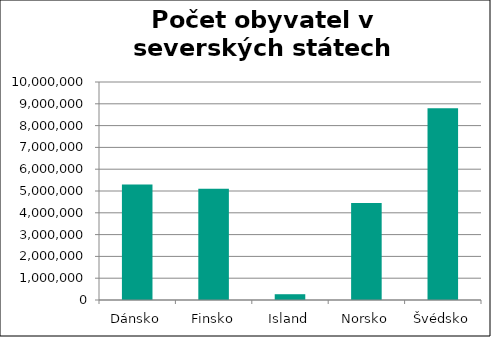
| Category | obyvatelstvo |
|---|---|
| Dánsko | 5300000 |
| Finsko | 5100000 |
| Island | 265000 |
| Norsko | 4450000 |
| Švédsko | 8800000 |